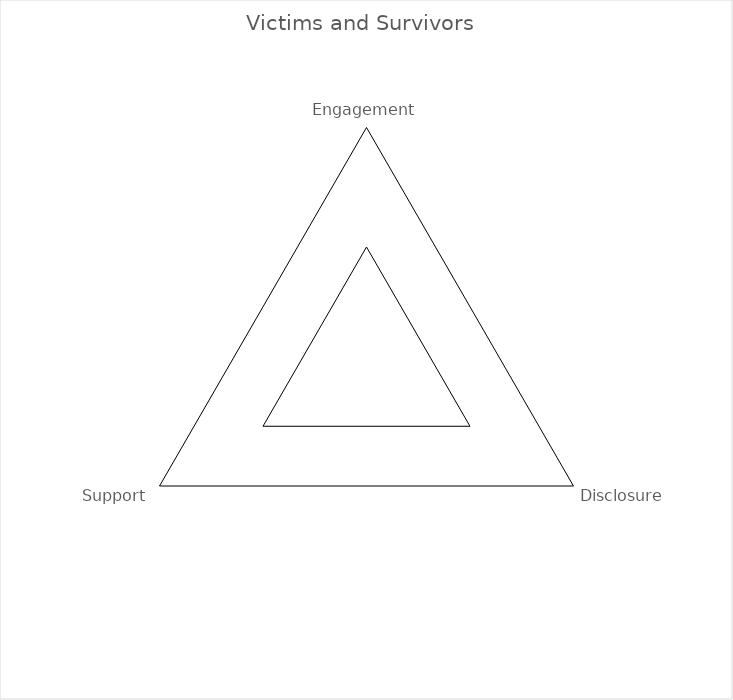
| Category | Series 0 |
|---|---|
| Engagement | 0 |
| Disclosure | 0 |
| Support | 0 |